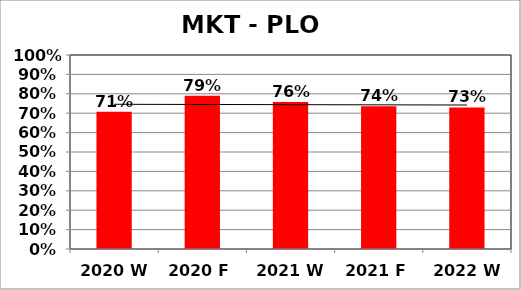
| Category | Series 0 |
|---|---|
| 2020 W | 0.707 |
| 2020 F | 0.79 |
| 2021 W | 0.758 |
| 2021 F | 0.735 |
| 2022 W | 0.73 |